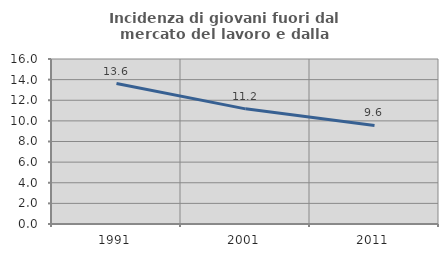
| Category | Incidenza di giovani fuori dal mercato del lavoro e dalla formazione  |
|---|---|
| 1991.0 | 13.615 |
| 2001.0 | 11.165 |
| 2011.0 | 9.554 |